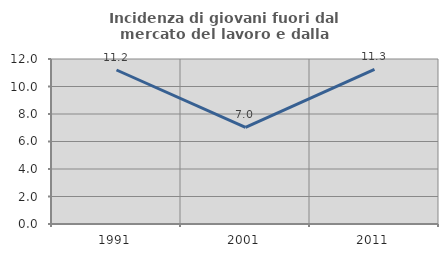
| Category | Incidenza di giovani fuori dal mercato del lavoro e dalla formazione  |
|---|---|
| 1991.0 | 11.2 |
| 2001.0 | 7.031 |
| 2011.0 | 11.25 |